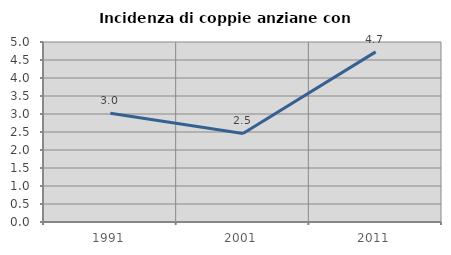
| Category | Incidenza di coppie anziane con figli |
|---|---|
| 1991.0 | 3.022 |
| 2001.0 | 2.459 |
| 2011.0 | 4.726 |